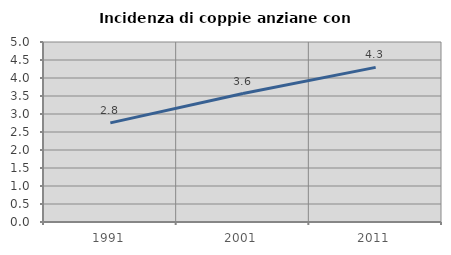
| Category | Incidenza di coppie anziane con figli |
|---|---|
| 1991.0 | 2.753 |
| 2001.0 | 3.569 |
| 2011.0 | 4.295 |